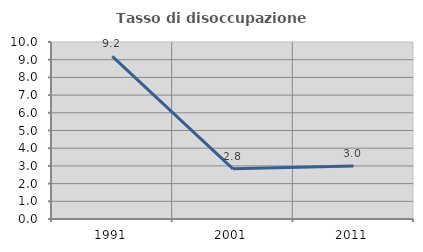
| Category | Tasso di disoccupazione giovanile  |
|---|---|
| 1991.0 | 9.189 |
| 2001.0 | 2.837 |
| 2011.0 | 3 |